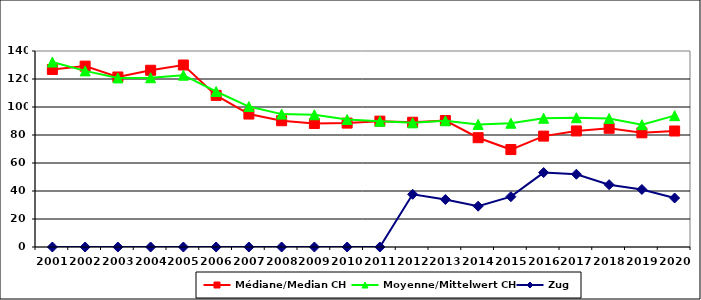
| Category | Médiane/Median CH | Moyenne/Mittelwert CH | Zug |
|---|---|---|---|
| 2001.0 | 126.8 | 132.1 | 0 |
| 2002.0 | 129.2 | 125.8 | 0 |
| 2003.0 | 121.45 | 120.775 | 0 |
| 2004.0 | 126.25 | 120.889 | 0 |
| 2005.0 | 130 | 122.728 | 0 |
| 2006.0 | 108.3 | 111.087 | 0 |
| 2007.0 | 94.96 | 100.307 | 0 |
| 2008.0 | 90.2 | 94.911 | 0 |
| 2009.0 | 88.22 | 94.453 | 0 |
| 2010.0 | 88.5 | 91.058 | 0 |
| 2011.0 | 89.9 | 89.805 | 0 |
| 2012.0 | 89.11 | 88.689 | 37.66 |
| 2013.0 | 90.35 | 90.167 | 33.93 |
| 2014.0 | 78.06 | 87.587 | 29.136 |
| 2015.0 | 69.6 | 88.398 | 35.955 |
| 2016.0 | 79.2 | 91.977 | 53.164 |
| 2017.0 | 82.9 | 92.339 | 51.975 |
| 2018.0 | 84.8 | 91.748 | 44.5 |
| 2019.0 | 81.555 | 87.386 | 41.1 |
| 2020.0 | 82.85 | 93.819 | 35 |